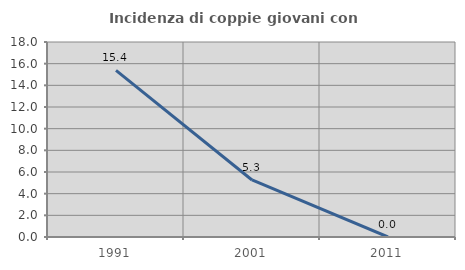
| Category | Incidenza di coppie giovani con figli |
|---|---|
| 1991.0 | 15.385 |
| 2001.0 | 5.263 |
| 2011.0 | 0 |